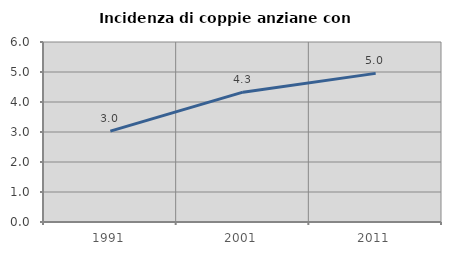
| Category | Incidenza di coppie anziane con figli |
|---|---|
| 1991.0 | 3.03 |
| 2001.0 | 4.327 |
| 2011.0 | 4.954 |